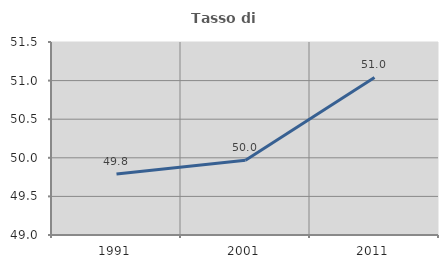
| Category | Tasso di occupazione   |
|---|---|
| 1991.0 | 49.792 |
| 2001.0 | 49.97 |
| 2011.0 | 51.041 |